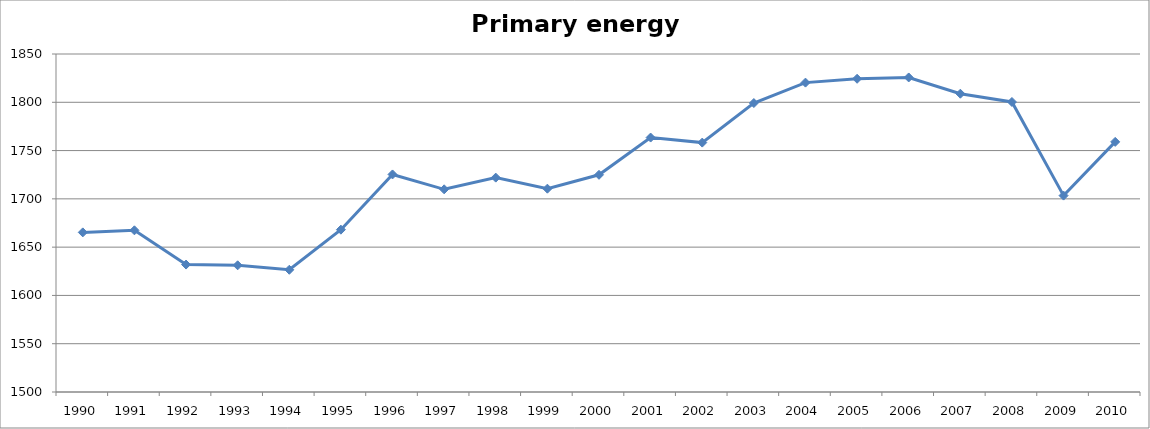
| Category | Total (as reported) |
|---|---|
| 1990.0 | 1665.287 |
| 1991.0 | 1667.42 |
| 1992.0 | 1631.947 |
| 1993.0 | 1631.199 |
| 1994.0 | 1626.566 |
| 1995.0 | 1668.106 |
| 1996.0 | 1725.275 |
| 1997.0 | 1709.869 |
| 1998.0 | 1721.983 |
| 1999.0 | 1710.535 |
| 2000.0 | 1724.906 |
| 2001.0 | 1763.479 |
| 2002.0 | 1758.25 |
| 2003.0 | 1799.209 |
| 2004.0 | 1820.371 |
| 2005.0 | 1824.343 |
| 2006.0 | 1825.703 |
| 2007.0 | 1808.886 |
| 2008.0 | 1800.315 |
| 2009.0 | 1703.369 |
| 2010.0 | 1759.015 |